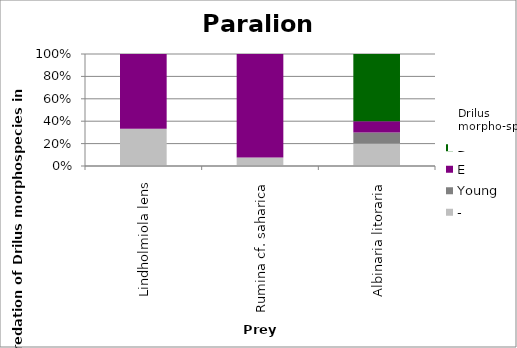
| Category | - | Young | E | D |
|---|---|---|---|---|
| Lindholmiola lens | 2 | 0 | 4 | 0 |
| Rumina cf. saharica | 2 | 0 | 24 | 0 |
| Albinaria litoraria | 2 | 1 | 1 | 6 |